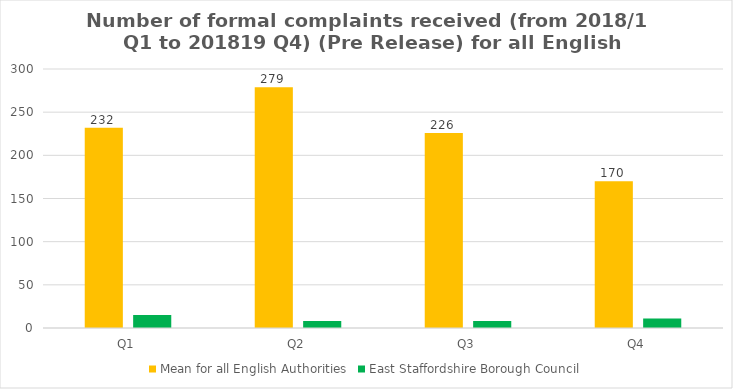
| Category | Mean for all English Authorities | East Staffordshire Borough Council |
|---|---|---|
| Q1 | 232 | 15 |
| Q2 | 279 | 8 |
| Q3 | 226 | 8 |
| Q4 | 170 | 11 |